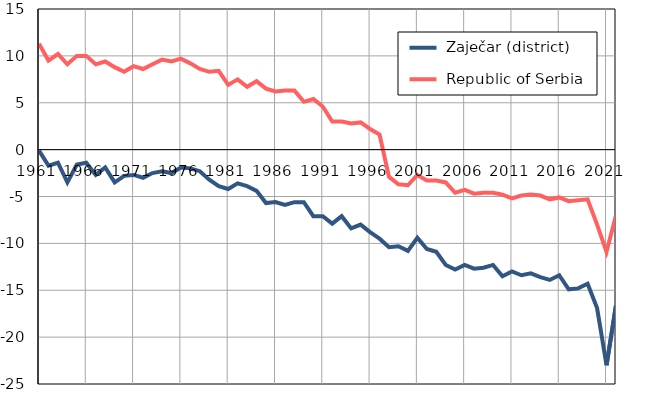
| Category |  Zaječar (district) |  Republic of Serbia |
|---|---|---|
| 1961.0 | -0.1 | 11.3 |
| 1962.0 | -1.7 | 9.5 |
| 1963.0 | -1.4 | 10.2 |
| 1964.0 | -3.5 | 9.1 |
| 1965.0 | -1.6 | 10 |
| 1966.0 | -1.4 | 10 |
| 1967.0 | -2.7 | 9.1 |
| 1968.0 | -1.9 | 9.4 |
| 1969.0 | -3.5 | 8.8 |
| 1970.0 | -2.8 | 8.3 |
| 1971.0 | -2.7 | 8.9 |
| 1972.0 | -3 | 8.6 |
| 1973.0 | -2.5 | 9.1 |
| 1974.0 | -2.3 | 9.6 |
| 1975.0 | -2.5 | 9.4 |
| 1976.0 | -1.9 | 9.7 |
| 1977.0 | -2 | 9.2 |
| 1978.0 | -2.3 | 8.6 |
| 1979.0 | -3.2 | 8.3 |
| 1980.0 | -3.9 | 8.4 |
| 1981.0 | -4.2 | 6.9 |
| 1982.0 | -3.6 | 7.5 |
| 1983.0 | -3.9 | 6.7 |
| 1984.0 | -4.4 | 7.3 |
| 1985.0 | -5.7 | 6.5 |
| 1986.0 | -5.6 | 6.2 |
| 1987.0 | -5.9 | 6.3 |
| 1988.0 | -5.6 | 6.3 |
| 1989.0 | -5.6 | 5.1 |
| 1990.0 | -7.1 | 5.4 |
| 1991.0 | -7.1 | 4.6 |
| 1992.0 | -7.9 | 3 |
| 1993.0 | -7.1 | 3 |
| 1994.0 | -8.4 | 2.8 |
| 1995.0 | -8 | 2.9 |
| 1996.0 | -8.8 | 2.2 |
| 1997.0 | -9.5 | 1.6 |
| 1998.0 | -10.4 | -2.9 |
| 1999.0 | -10.3 | -3.7 |
| 2000.0 | -10.8 | -3.8 |
| 2001.0 | -9.4 | -2.7 |
| 2002.0 | -10.6 | -3.3 |
| 2003.0 | -10.9 | -3.3 |
| 2004.0 | -12.3 | -3.5 |
| 2005.0 | -12.8 | -4.6 |
| 2006.0 | -12.3 | -4.3 |
| 2007.0 | -12.7 | -4.7 |
| 2008.0 | -12.6 | -4.6 |
| 2009.0 | -12.3 | -4.6 |
| 2010.0 | -13.5 | -4.8 |
| 2011.0 | -13 | -5.2 |
| 2012.0 | -13.4 | -4.9 |
| 2013.0 | -13.2 | -4.8 |
| 2014.0 | -13.6 | -4.9 |
| 2015.0 | -13.9 | -5.3 |
| 2016.0 | -13.4 | -5.1 |
| 2017.0 | -14.9 | -5.5 |
| 2018.0 | -14.8 | -5.4 |
| 2019.0 | -14.3 | -5.3 |
| 2020.0 | -16.9 | -8 |
| 2021.0 | -23 | -10.9 |
| 2022.0 | -16.6 | -7 |